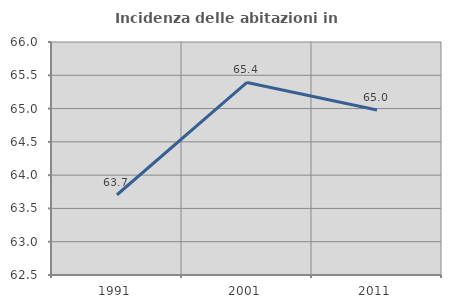
| Category | Incidenza delle abitazioni in proprietà  |
|---|---|
| 1991.0 | 63.705 |
| 2001.0 | 65.392 |
| 2011.0 | 64.979 |